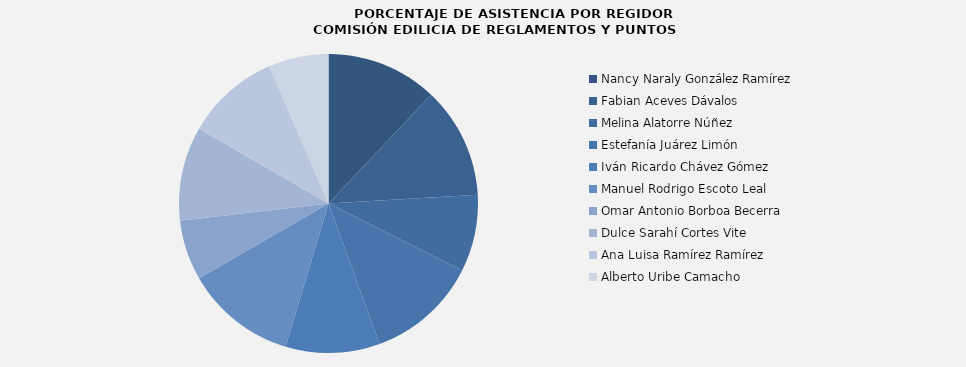
| Category | Nancy Naraly González Ramírez  |
|---|---|
| Nancy Naraly González Ramírez  | 100 |
| Fabian Aceves Dávalos | 100 |
| Melina Alatorre Núñez | 69.231 |
| Estefanía Juárez Limón | 100 |
| Iván Ricardo Chávez Gómez | 84.615 |
| Manuel Rodrigo Escoto Leal | 100 |
| Omar Antonio Borboa Becerra | 53.846 |
| Dulce Sarahí Cortes Vite | 84.615 |
| Ana Luisa Ramírez Ramírez | 84.615 |
| Alberto Uribe Camacho | 53.846 |